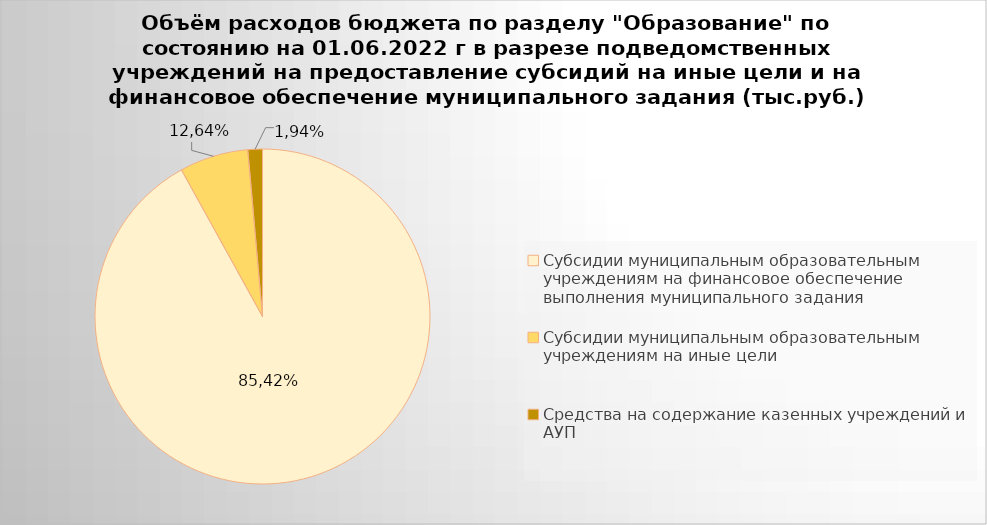
| Category | Series 0 |
|---|---|
| Субсидии муниципальным образовательным учреждениям на финансовое обеспечение выполнения муниципального задания | 7027036.71 |
| Субсидии муниципальным образовательным учреждениям на иные цели | 506960.79 |
| Средства на содержание казенных учреждений и АУП | 107127.3 |